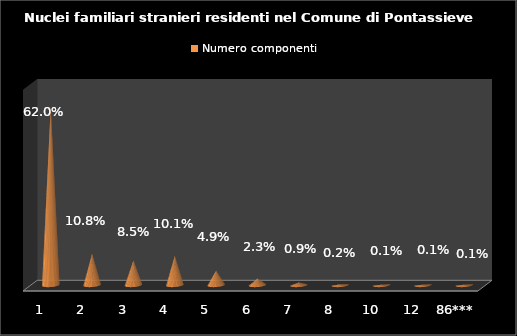
| Category | Numero componenti |
|---|---|
| 1  | 0.62 |
| 2  | 0.108 |
| 3  | 0.085 |
| 4  | 0.101 |
| 5  | 0.049 |
| 6  | 0.023 |
| 7  | 0.009 |
| 8  | 0.002 |
| 10  | 0.001 |
| 12  | 0.001 |
| 86*** | 0.001 |